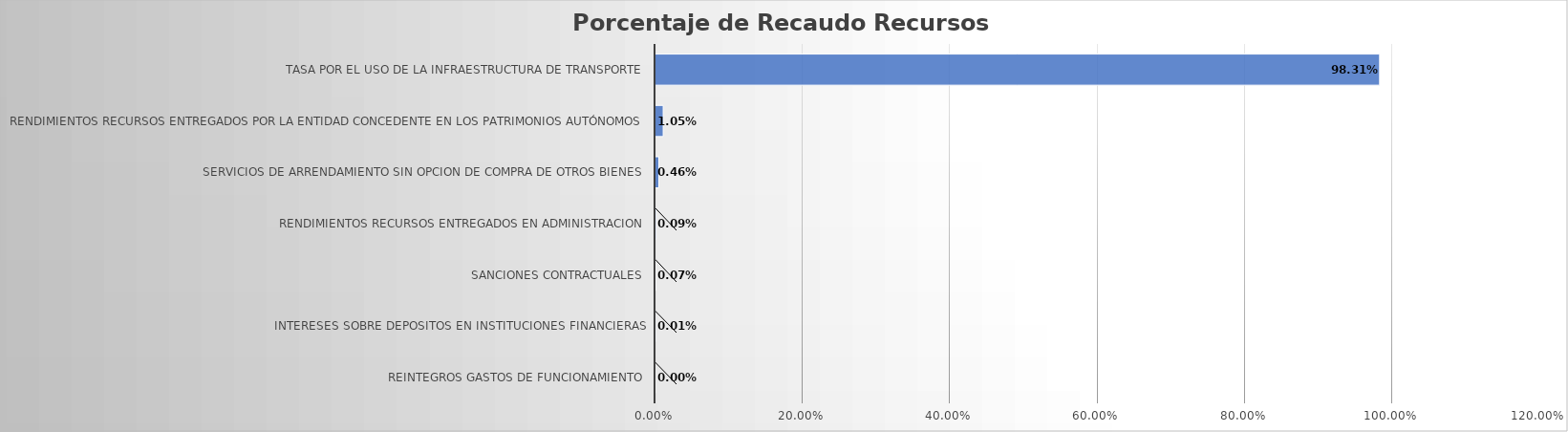
| Category | Total |
|---|---|
| REINTEGROS GASTOS DE FUNCIONAMIENTO | 0 |
| INTERESES SOBRE DEPOSITOS EN INSTITUCIONES FINANCIERAS | 0 |
| SANCIONES CONTRACTUALES | 0.001 |
| RENDIMIENTOS RECURSOS ENTREGADOS EN ADMINISTRACION | 0.001 |
| SERVICIOS DE ARRENDAMIENTO SIN OPCION DE COMPRA DE OTROS BIENES | 0.005 |
| RENDIMIENTOS RECURSOS ENTREGADOS POR LA ENTIDAD CONCEDENTE EN LOS PATRIMONIOS AUTÓNOMOS | 0.01 |
| TASA POR EL USO DE LA INFRAESTRUCTURA DE TRANSPORTE | 0.983 |